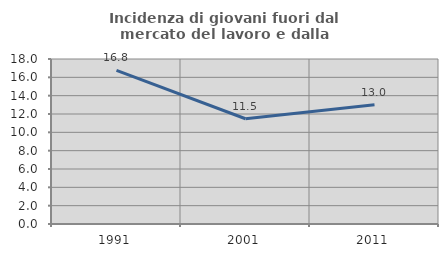
| Category | Incidenza di giovani fuori dal mercato del lavoro e dalla formazione  |
|---|---|
| 1991.0 | 16.76 |
| 2001.0 | 11.48 |
| 2011.0 | 13.008 |